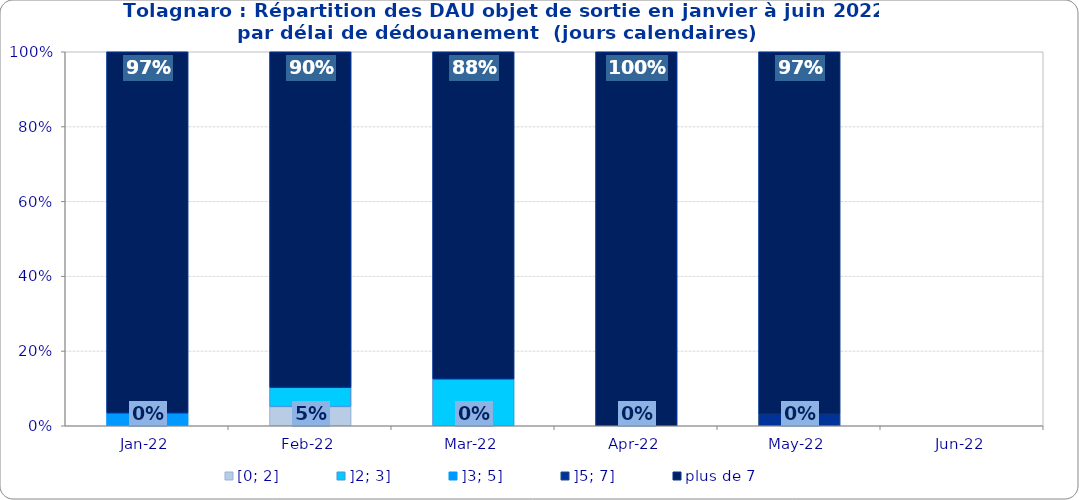
| Category | [0; 2] | ]2; 3] | ]3; 5] | ]5; 7] | plus de 7 |
|---|---|---|---|---|---|
| 2022-01-01 | 0 | 0 | 0.034 | 0 | 0.966 |
| 2022-02-01 | 0.051 | 0.051 | 0 | 0 | 0.897 |
| 2022-03-01 | 0 | 0.125 | 0 | 0 | 0.875 |
| 2022-04-01 | 0 | 0 | 0 | 0 | 1 |
| 2022-05-01 | 0 | 0 | 0 | 0.031 | 0.969 |
| 2022-06-01 | 0 | 0 | 0 | 0 | 0 |